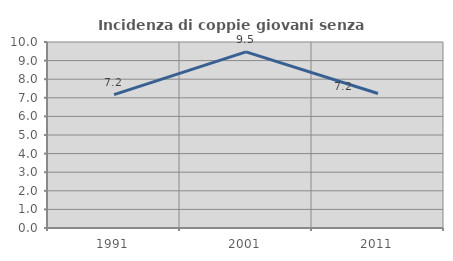
| Category | Incidenza di coppie giovani senza figli |
|---|---|
| 1991.0 | 7.167 |
| 2001.0 | 9.469 |
| 2011.0 | 7.234 |